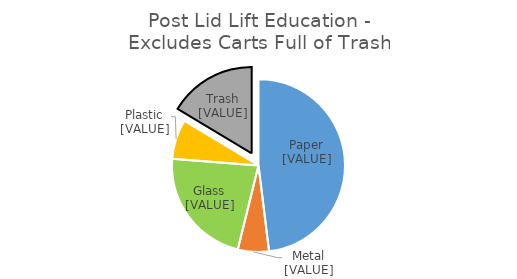
| Category | Series 0 |
|---|---|
| Paper | 0.48 |
| Metals | 0.058 |
| Glass | 0.224 |
| Plastic | 0.074 |
| Trash  | 0.164 |